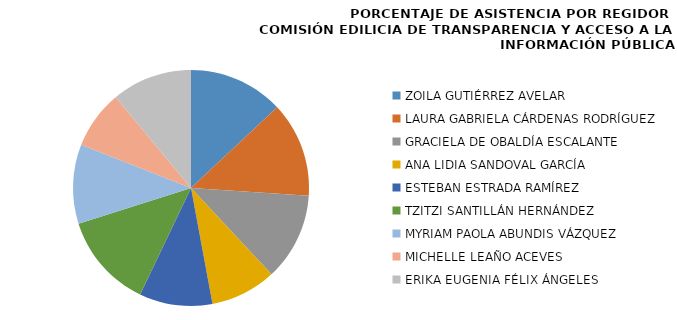
| Category | Series 0 |
|---|---|
| ZOILA GUTIÉRREZ AVELAR | 100 |
| LAURA GABRIELA CÁRDENAS RODRÍGUEZ | 100 |
| GRACIELA DE OBALDÍA ESCALANTE | 92.308 |
| ANA LIDIA SANDOVAL GARCÍA | 69.231 |
| ESTEBAN ESTRADA RAMÍREZ | 76.923 |
| TZITZI SANTILLÁN HERNÁNDEZ | 100 |
| MYRIAM PAOLA ABUNDIS VÁZQUEZ | 83.333 |
| MICHELLE LEAÑO ACEVES | 61.538 |
| ERIKA EUGENIA FÉLIX ÁNGELES | 84.615 |